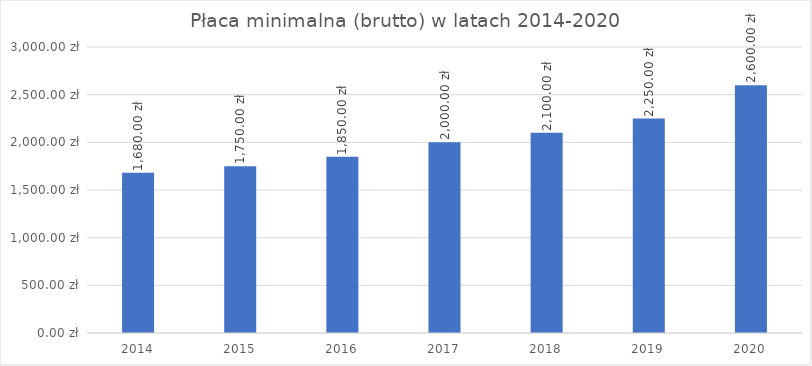
| Category | Series 0 |
|---|---|
| 2014.0 | 1680 |
| 2015.0 | 1750 |
| 2016.0 | 1850 |
| 2017.0 | 2000 |
| 2018.0 | 2100 |
| 2019.0 | 2250 |
| 2020.0 | 2600 |